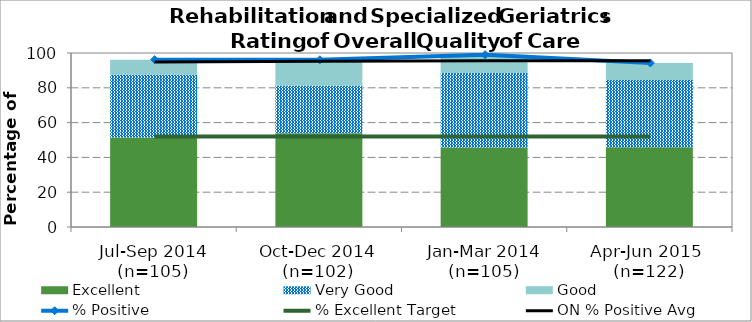
| Category | Excellent | Very Good | Good |
|---|---|---|---|
| Jul-Sep 2014 (n=105) | 51.43 | 36.19 | 8.57 |
| Oct-Dec 2014 (n=102) | 53.92 | 27.45 | 14.71 |
| Jan-Mar 2014 (n=105) | 45.71 | 42.86 | 10.48 |
| Apr-Jun 2015 
(n=122) | 45.9 | 38.52 | 9.84 |